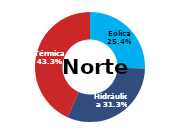
| Category | Norte |
|---|---|
| Eólica | 94.596 |
| Hidráulica | 116.542 |
| Solar | 0 |
| Térmica | 161.158 |